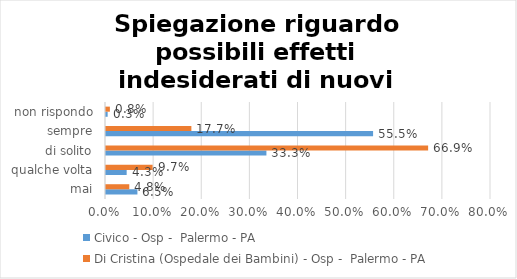
| Category | Civico - Osp -  Palermo - PA | Di Cristina (Ospedale dei Bambini) - Osp -  Palermo - PA |
|---|---|---|
| mai | 0.065 | 0.048 |
| qualche volta | 0.043 | 0.097 |
| di solito | 0.333 | 0.669 |
| sempre | 0.555 | 0.177 |
| non rispondo | 0.003 | 0.008 |